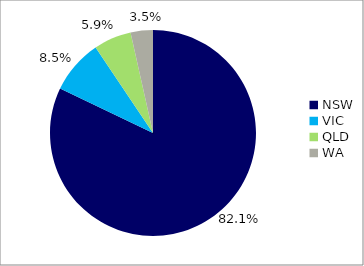
| Category | Series 0 |
|---|---|
| NSW | 0.821 |
| VIC | 0.085 |
| QLD | 0.059 |
| WA | 0.035 |